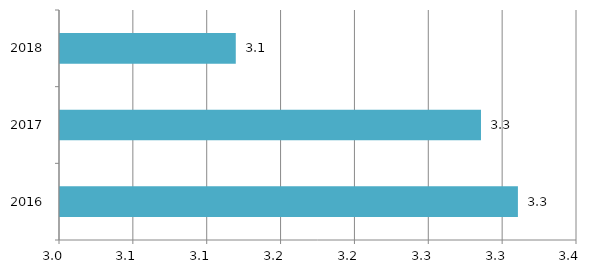
| Category | Series 0 |
|---|---|
| 2016.0 | 3.31 |
| 2017.0 | 3.285 |
| 2018.0 | 3.119 |